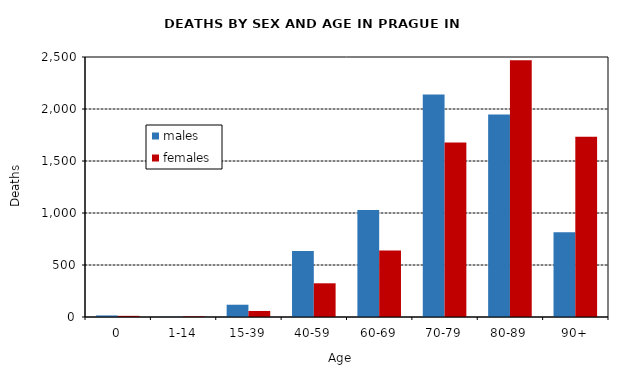
| Category | males | females |
|---|---|---|
| 0 | 15 | 11 |
| 1-14 | 2 | 6 |
| 15-39 | 118 | 58 |
| 40-59 | 634 | 324 |
| 60-69 | 1030 | 640 |
| 70-79 | 2140 | 1678 |
| 80-89 | 1947 | 2469 |
| 90+ | 815 | 1734 |